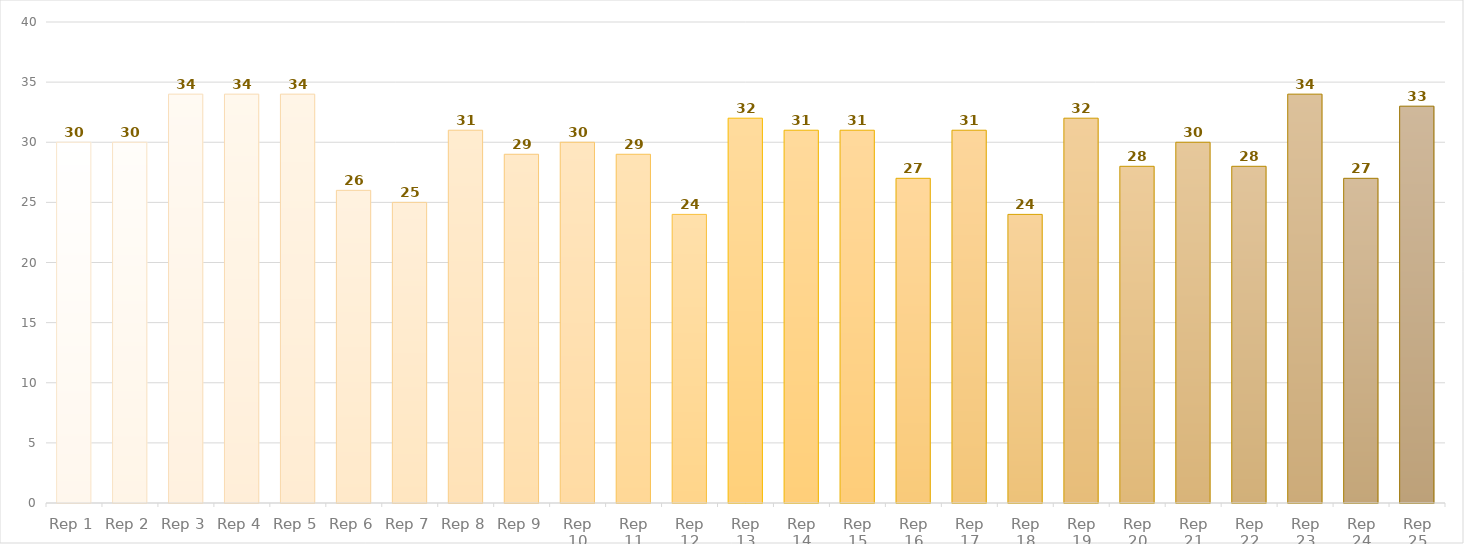
| Category | TOTAL CLIENT CONTACT HOURS |
|---|---|
| Rep 1 | 30 |
| Rep 2 | 30 |
| Rep 3 | 34 |
| Rep 4 | 34 |
| Rep 5 | 34 |
| Rep 6 | 26 |
| Rep 7 | 25 |
| Rep 8 | 31 |
| Rep 9 | 29 |
| Rep 10 | 30 |
| Rep 11 | 29 |
| Rep 12 | 24 |
| Rep 13 | 32 |
| Rep 14 | 31 |
| Rep 15 | 31 |
| Rep 16 | 27 |
| Rep 17 | 31 |
| Rep 18 | 24 |
| Rep 19 | 32 |
| Rep 20 | 28 |
| Rep 21 | 30 |
| Rep 22 | 28 |
| Rep 23 | 34 |
| Rep 24 | 27 |
| Rep 25 | 33 |